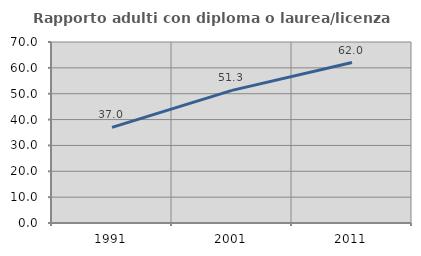
| Category | Rapporto adulti con diploma o laurea/licenza media  |
|---|---|
| 1991.0 | 36.989 |
| 2001.0 | 51.285 |
| 2011.0 | 62.048 |